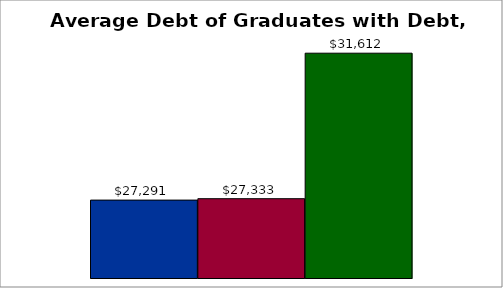
| Category | 50 states and D.C. | SREB states | State |
|---|---|---|---|
| 0 | 27291 | 27332.625 | 31612 |